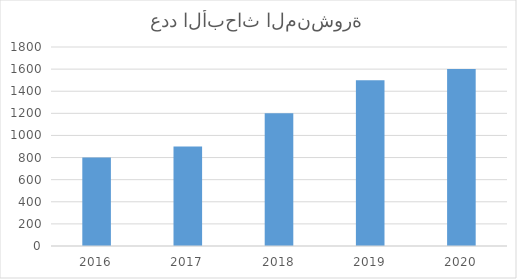
| Category | Series 0 |
|---|---|
| 2016.0 | 800 |
| 2017.0 | 900 |
| 2018.0 | 1200 |
| 2019.0 | 1500 |
| 2020.0 | 1600 |